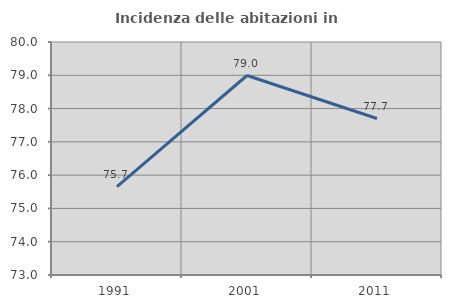
| Category | Incidenza delle abitazioni in proprietà  |
|---|---|
| 1991.0 | 75.655 |
| 2001.0 | 78.993 |
| 2011.0 | 77.701 |